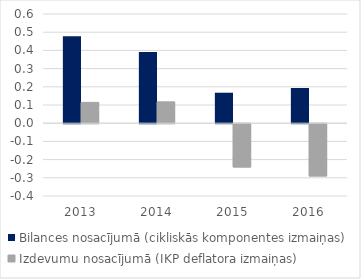
| Category | Bilances nosacījumā (cikliskās komponentes izmaiņas) | Izdevumu nosacījumā (IKP deflatora izmaiņas) |
|---|---|---|
| 2013.0 | 0.477 | 0.115 |
| 2014.0 | 0.391 | 0.117 |
| 2015.0 | 0.167 | -0.238 |
| 2016.0 | 0.193 | -0.287 |